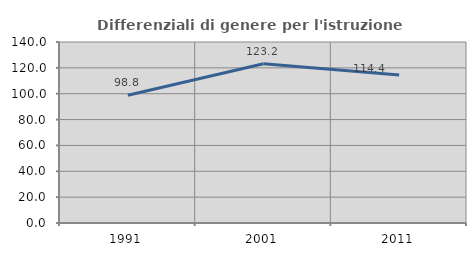
| Category | Differenziali di genere per l'istruzione superiore |
|---|---|
| 1991.0 | 98.808 |
| 2001.0 | 123.218 |
| 2011.0 | 114.391 |